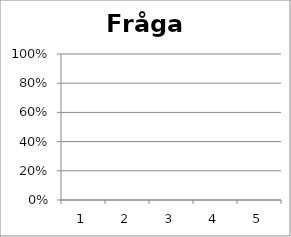
| Category | Fråga 9 |
|---|---|
| 0 | 0 |
| 1 | 0 |
| 2 | 0 |
| 3 | 0 |
| 4 | 0 |